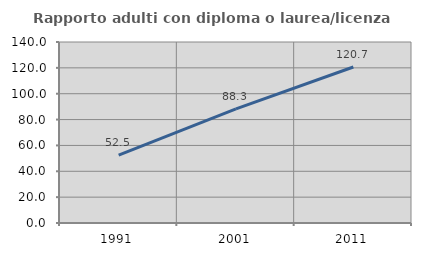
| Category | Rapporto adulti con diploma o laurea/licenza media  |
|---|---|
| 1991.0 | 52.451 |
| 2001.0 | 88.316 |
| 2011.0 | 120.652 |